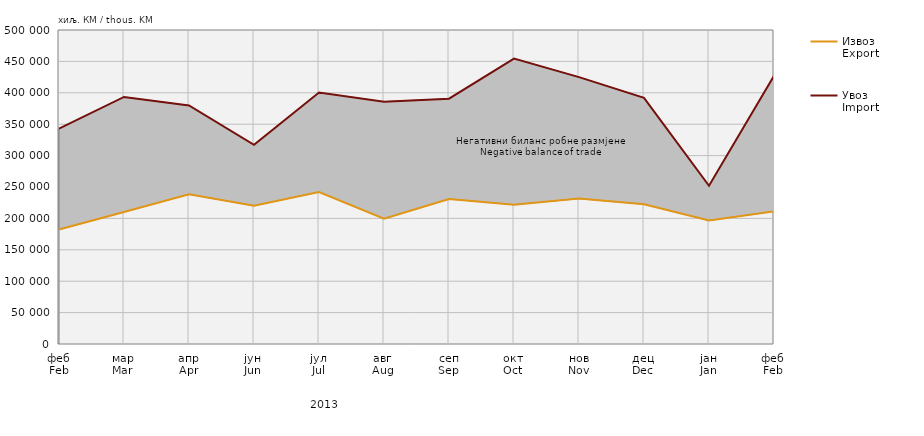
| Category | Извоз
Export | Увоз
Import |
|---|---|---|
| феб
Feb | 182220 | 342893 |
| мар
Mar | 210184 | 393365 |
| апр
Apr | 238435 | 379748 |
| јун
Jun | 220173 | 317176 |
| јул
Jul | 242098 | 400481 |
| авг
Aug | 199427 | 385911 |
| сеп
Sep | 230912 | 390579 |
| окт
Oct | 221870 | 454480 |
| нов
Nov | 231500 | 424992 |
| дец
Dec | 222497 | 391993 |
| јан
Jan | 196665 | 251906 |
| феб
Feb | 211099 | 427126 |